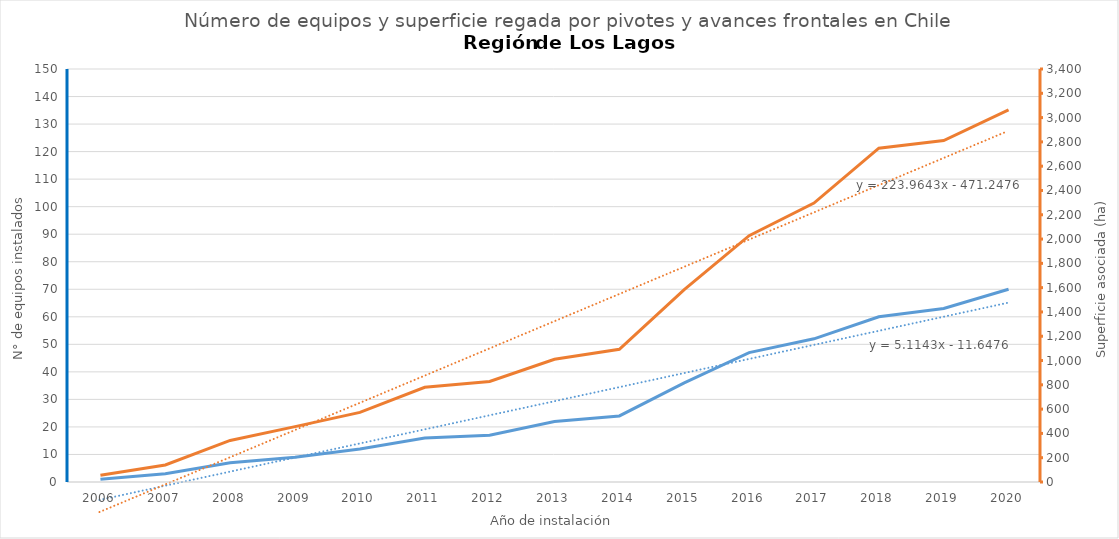
| Category | N° |
|---|---|
| 2006.0 | 1 |
| 2007.0 | 3 |
| 2008.0 | 7 |
| 2009.0 | 9 |
| 2010.0 | 12 |
| 2011.0 | 16 |
| 2012.0 | 17 |
| 2013.0 | 22 |
| 2014.0 | 24 |
| 2015.0 | 36 |
| 2016.0 | 47 |
| 2017.0 | 52 |
| 2018.0 | 60 |
| 2019.0 | 63 |
| 2020.0 | 70 |